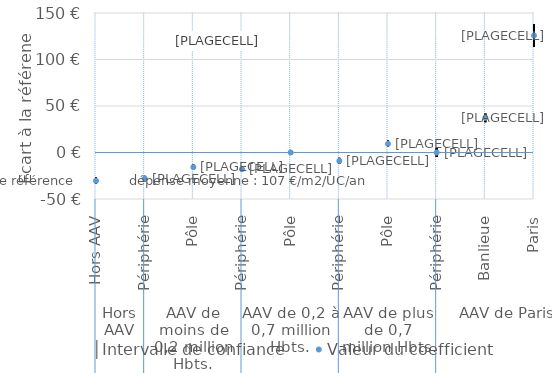
| Category | │Intervalle de confiance | Series 1 | Valeur du coefficient |
|---|---|---|---|
| 0 | -27.006 | -33.77 | -30.388 |
| 1 | -25.072 | -30.97 | -28.021 |
| 2 | -12.751 | -18.785 | -15.768 |
| 3 | -14.979 | -21.018 | -17.998 |
| 4 | 0 | 0 | 0 |
| 5 | -5.694 | -12.407 | -9.05 |
| 6 | 12.986 | 5.791 | 9.389 |
| 7 | 4.845 | -4.854 | -0.005 |
| 8 | 41.98 | 32.556 | 37.268 |
| 9 | 138.003 | 113.45 | 125.726 |